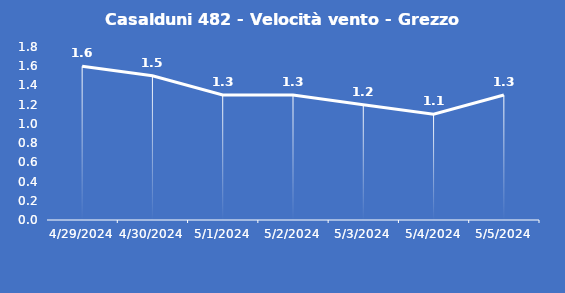
| Category | Casalduni 482 - Velocità vento - Grezzo (m/s) |
|---|---|
| 4/29/24 | 1.6 |
| 4/30/24 | 1.5 |
| 5/1/24 | 1.3 |
| 5/2/24 | 1.3 |
| 5/3/24 | 1.2 |
| 5/4/24 | 1.1 |
| 5/5/24 | 1.3 |